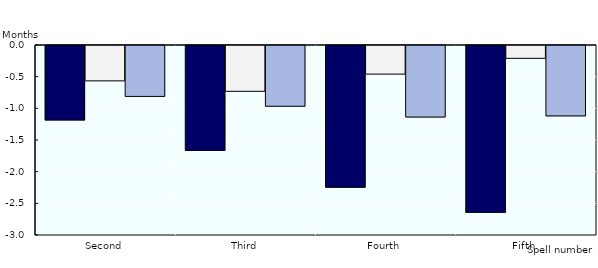
| Category | Basic | Restricted | Cohort |
|---|---|---|---|
| Second | -1.175 | -0.558 | -0.804 |
| Third | -1.657 | -0.724 | -0.959 |
| Fourth | -2.237 | -0.452 | -1.13 |
| Fifth | -2.634 | -0.203 | -1.112 |